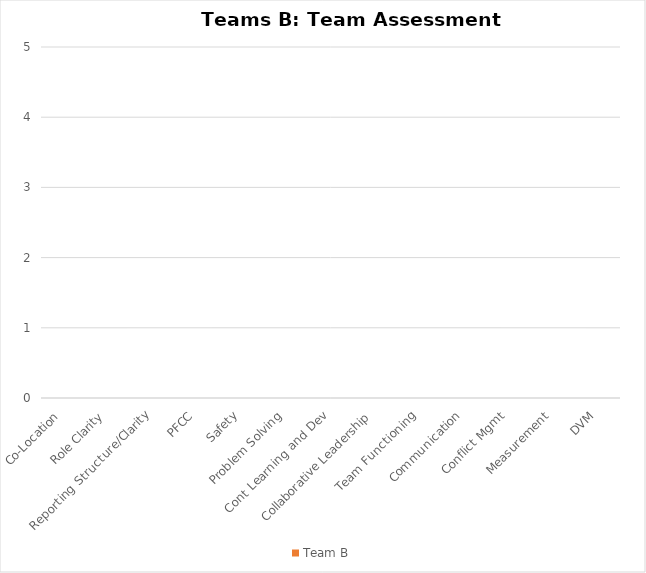
| Category | Team B |
|---|---|
| Co-Location | 0 |
| Role Clarity | 0 |
| Reporting Structure/Clarity | 0 |
| PFCC | 0 |
| Safety | 0 |
| Problem Solving | 0 |
| Cont Learning and Dev | 0 |
| Collaborative Leadership | 0 |
| Team Functioning | 0 |
| Communication | 0 |
| Conflict Mgmt | 0 |
| Measurement | 0 |
| DVM | 0 |